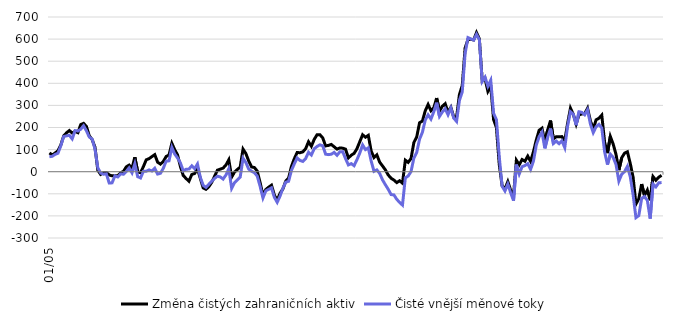
| Category | Změna čistých zahraničních aktiv | Čisté vnější měnové toky |
|---|---|---|
| 2005-01-01 | 84.602 | 67.742 |
| 2005-02-01 | 75.768 | 69.754 |
| 2005-03-01 | 84.565 | 78.479 |
| 2005-04-01 | 94.867 | 83.466 |
| 2005-05-01 | 120.796 | 117.752 |
| 2005-06-01 | 161.661 | 159.083 |
| 2005-07-01 | 175.894 | 162.193 |
| 2005-08-01 | 186.284 | 164.691 |
| 2005-09-01 | 175.003 | 148.417 |
| 2005-10-01 | 182.174 | 185.904 |
| 2005-11-01 | 176.606 | 184.289 |
| 2005-12-01 | 213.319 | 192.242 |
| 2006-01-01 | 218.733 | 207.939 |
| 2006-02-01 | 204.528 | 185.08 |
| 2006-03-01 | 162.228 | 156.78 |
| 2006-04-01 | 145.362 | 147.754 |
| 2006-05-01 | 111.135 | 102.606 |
| 2006-06-01 | 6.662 | 17.415 |
| 2006-07-01 | -12.166 | -6.296 |
| 2006-08-01 | -4.168 | -11.297 |
| 2006-09-01 | -3.265 | -9.8 |
| 2006-10-01 | -14.718 | -51.337 |
| 2006-11-01 | -18.699 | -50.437 |
| 2006-12-01 | -18.761 | -18.99 |
| 2007-01-01 | -18.794 | -23.779 |
| 2007-02-01 | -4.785 | -10.331 |
| 2007-03-01 | 1.322 | -11.333 |
| 2007-04-01 | 21.973 | 1.001 |
| 2007-05-01 | 29.944 | 17.265 |
| 2007-06-01 | 15.49 | -4.947 |
| 2007-07-01 | 65.435 | 35.61 |
| 2007-08-01 | -1.17 | -22.329 |
| 2007-09-01 | -4.492 | -28.356 |
| 2007-10-01 | 22.832 | 1.507 |
| 2007-11-01 | 53.698 | 2.105 |
| 2007-12-01 | 59.105 | 8.073 |
| 2008-01-01 | 68.422 | 3.251 |
| 2008-02-01 | 77.146 | 15.499 |
| 2008-03-01 | 43.111 | -10.56 |
| 2008-04-01 | 34.295 | -7.237 |
| 2008-05-01 | 46.499 | 15.561 |
| 2008-06-01 | 68.778 | 47.865 |
| 2008-07-01 | 75.541 | 49.158 |
| 2008-08-01 | 128.455 | 109.871 |
| 2008-09-01 | 99.379 | 80.045 |
| 2008-10-01 | 76.425 | 62.419 |
| 2008-11-01 | 23.697 | 39.814 |
| 2008-12-01 | -17.238 | 3.439 |
| 2009-01-01 | -30.81 | 11.219 |
| 2009-02-01 | -42.978 | 11.866 |
| 2009-03-01 | -12.659 | 26.365 |
| 2009-04-01 | -8.258 | 13.341 |
| 2009-05-01 | 13.629 | 34.681 |
| 2009-06-01 | -30.493 | -26.083 |
| 2009-07-01 | -73.165 | -61.587 |
| 2009-08-01 | -79.753 | -70.972 |
| 2009-09-01 | -67.73 | -56.797 |
| 2009-10-01 | -48.338 | -43.667 |
| 2009-11-01 | -20.878 | -30.458 |
| 2009-12-01 | 6.985 | -20.283 |
| 2010-01-01 | 11.571 | -23.811 |
| 2010-02-01 | 16.327 | -33.36 |
| 2010-03-01 | 30.202 | -14.966 |
| 2010-04-01 | 53.937 | 13.234 |
| 2010-05-01 | -24.51 | -75.025 |
| 2010-06-01 | -1.701 | -49.614 |
| 2010-07-01 | 9.895 | -36.86 |
| 2010-08-01 | 20.827 | -24.786 |
| 2010-09-01 | 102.244 | 61.041 |
| 2010-10-01 | 82.07 | 41.544 |
| 2010-11-01 | 48.49 | 11.583 |
| 2010-12-01 | 21.595 | 2.158 |
| 2011-01-01 | 18.876 | -4.419 |
| 2011-02-01 | 2.622 | -20.317 |
| 2011-03-01 | -49.304 | -66.419 |
| 2011-04-01 | -106.947 | -118.835 |
| 2011-05-01 | -80.67 | -86.757 |
| 2011-06-01 | -70.021 | -79.882 |
| 2011-07-01 | -60.962 | -72.934 |
| 2011-08-01 | -105.797 | -115.817 |
| 2011-09-01 | -129.501 | -138.462 |
| 2011-10-01 | -97.518 | -110.581 |
| 2011-11-01 | -78.197 | -74.537 |
| 2011-12-01 | -42.679 | -47.53 |
| 2012-01-01 | -29.112 | -43.465 |
| 2012-02-01 | 23.815 | 6.03 |
| 2012-03-01 | 58.542 | 35.278 |
| 2012-04-01 | 86.743 | 62.241 |
| 2012-05-01 | 85.993 | 50.944 |
| 2012-06-01 | 89.745 | 46.452 |
| 2012-07-01 | 104.245 | 59.744 |
| 2012-08-01 | 135.46 | 87.982 |
| 2012-09-01 | 115.213 | 75.569 |
| 2012-10-01 | 146.331 | 103.813 |
| 2012-11-01 | 167.246 | 114.222 |
| 2012-12-01 | 167.414 | 121.586 |
| 2013-01-01 | 152.876 | 116.925 |
| 2013-02-01 | 116.592 | 79.382 |
| 2013-03-01 | 119.069 | 77.228 |
| 2013-04-01 | 123.293 | 79.122 |
| 2013-05-01 | 112.653 | 87.399 |
| 2013-06-01 | 102.163 | 74.155 |
| 2013-07-01 | 107.454 | 90.001 |
| 2013-08-01 | 106.465 | 90.765 |
| 2013-09-01 | 101.981 | 59.142 |
| 2013-10-01 | 62.14 | 30.708 |
| 2013-11-01 | 74.663 | 36.578 |
| 2013-12-01 | 82.718 | 27.217 |
| 2014-01-01 | 103.873 | 53.978 |
| 2014-02-01 | 135.496 | 84.209 |
| 2014-03-01 | 167.072 | 121.102 |
| 2014-04-01 | 155.977 | 99.954 |
| 2014-05-01 | 164.473 | 107.861 |
| 2014-06-01 | 93.904 | 48.556 |
| 2014-07-01 | 64.113 | 1.586 |
| 2014-08-01 | 76.026 | 8.12 |
| 2014-09-01 | 42.969 | -8.053 |
| 2014-10-01 | 26.059 | -37.31 |
| 2014-11-01 | 8.059 | -59.117 |
| 2014-12-01 | -15.012 | -79.702 |
| 2015-01-01 | -29.624 | -103.37 |
| 2015-02-01 | -37.976 | -105.142 |
| 2015-03-01 | -49.245 | -125.194 |
| 2015-04-01 | -40.93 | -138.682 |
| 2015-05-01 | -52.006 | -151.08 |
| 2015-06-01 | 52.138 | -27.916 |
| 2015-07-01 | 42.19 | -19.548 |
| 2015-08-01 | 59.355 | 0.616 |
| 2015-09-01 | 132.123 | 61.715 |
| 2015-10-01 | 157.496 | 87.238 |
| 2015-11-01 | 221.645 | 147.184 |
| 2015-12-01 | 229.134 | 178.373 |
| 2016-01-01 | 275.633 | 233.851 |
| 2016-02-01 | 304.065 | 257.324 |
| 2016-03-01 | 275.872 | 238.001 |
| 2016-04-01 | 289.172 | 271.333 |
| 2016-05-01 | 333.132 | 312.25 |
| 2016-06-01 | 275.061 | 250.304 |
| 2016-07-01 | 296.226 | 269.814 |
| 2016-08-01 | 307.569 | 285.273 |
| 2016-09-01 | 269.195 | 257.496 |
| 2016-10-01 | 291.1 | 288.182 |
| 2016-11-01 | 247.737 | 242.725 |
| 2016-12-01 | 247.105 | 227.438 |
| 2017-01-01 | 348.817 | 322.292 |
| 2017-02-01 | 390.415 | 361.713 |
| 2017-03-01 | 560.135 | 535.461 |
| 2017-04-01 | 598.344 | 606.82 |
| 2017-05-01 | 598.977 | 600.858 |
| 2017-06-01 | 596.166 | 595.57 |
| 2017-07-01 | 629.416 | 621.638 |
| 2017-08-01 | 601.233 | 597.149 |
| 2017-09-01 | 412.849 | 407.873 |
| 2017-10-01 | 421.367 | 427.586 |
| 2017-11-01 | 363.582 | 386.555 |
| 2017-12-01 | 387.305 | 413.92 |
| 2018-01-01 | 235.716 | 264.296 |
| 2018-02-01 | 199.669 | 235.147 |
| 2018-03-01 | 31.722 | 65.964 |
| 2018-04-01 | -64.367 | -65.71 |
| 2018-05-01 | -77.832 | -87.233 |
| 2018-06-01 | -44.903 | -56.038 |
| 2018-07-01 | -84.093 | -95.425 |
| 2018-08-01 | -110.026 | -130.751 |
| 2018-09-01 | 51.922 | 32.057 |
| 2018-10-01 | 31.137 | -10.283 |
| 2018-11-01 | 55.059 | 22.546 |
| 2018-12-01 | 47.389 | 27.782 |
| 2019-01-01 | 70.498 | 36.35 |
| 2019-02-01 | 46.698 | 10.372 |
| 2019-03-01 | 90.65 | 48.02 |
| 2019-04-01 | 143.34 | 120.878 |
| 2019-05-01 | 187.409 | 158.262 |
| 2019-06-01 | 196.861 | 178.914 |
| 2019-07-01 | 135.278 | 105.694 |
| 2019-08-01 | 189.124 | 156.059 |
| 2019-09-01 | 231.431 | 195.16 |
| 2019-10-01 | 147.791 | 127.403 |
| 2019-11-01 | 158.529 | 138.611 |
| 2019-12-01 | 158.633 | 126.739 |
| 2020-01-01 | 158.719 | 139.749 |
| 2020-02-01 | 140.761 | 108.939 |
| 2020-03-01 | 219.177 | 207.615 |
| 2020-04-01 | 287.549 | 271.308 |
| 2020-05-01 | 259.467 | 260.148 |
| 2020-06-01 | 215.544 | 210.485 |
| 2020-07-01 | 256.966 | 271.15 |
| 2020-08-01 | 261.494 | 268.54 |
| 2020-09-01 | 262.382 | 257.592 |
| 2020-10-01 | 287.288 | 280.437 |
| 2020-11-01 | 230.463 | 215.749 |
| 2020-12-01 | 193.347 | 176.615 |
| 2021-01-01 | 234.762 | 203.285 |
| 2021-02-01 | 241.866 | 214.219 |
| 2021-03-01 | 256.068 | 197.809 |
| 2021-04-01 | 133.391 | 89.394 |
| 2021-05-01 | 84.025 | 32.133 |
| 2021-06-01 | 159.539 | 79.489 |
| 2021-07-01 | 124.997 | 64.783 |
| 2021-08-01 | 77.773 | 32.653 |
| 2021-09-01 | 7.261 | -42.703 |
| 2021-10-01 | 63.097 | -11.354 |
| 2021-11-01 | 83.833 | 0.38 |
| 2021-12-01 | 90.092 | 24.262 |
| 2022-01-01 | 37.183 | -22.688 |
| 2022-02-01 | -24.697 | -104.484 |
| 2022-03-01 | -146.248 | -207.922 |
| 2022-04-01 | -122.119 | -198.503 |
| 2022-05-01 | -56.107 | -120.854 |
| 2022-06-01 | -107.367 | -112.218 |
| 2022-07-01 | -83.239 | -129.638 |
| 2022-08-01 | -129.191 | -212.216 |
| 2022-09-01 | -22.199 | -55.96 |
| 2022-10-01 | -38.653 | -68.581 |
| 2022-11-01 | -24.918 | -50.343 |
| 2022-12-01 | -16.316 | -49.175 |